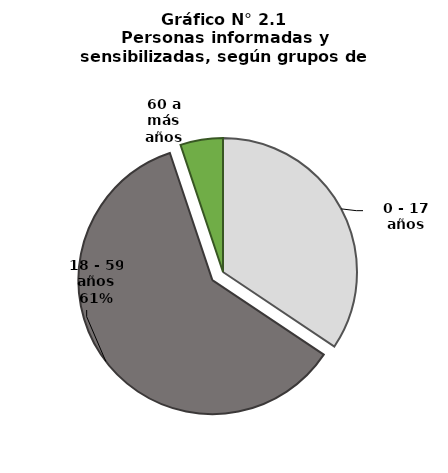
| Category | Series 0 |
|---|---|
| 0 - 17 años | 504460 |
| 18 - 59 años | 887424 |
| 60 a más años | 75329 |